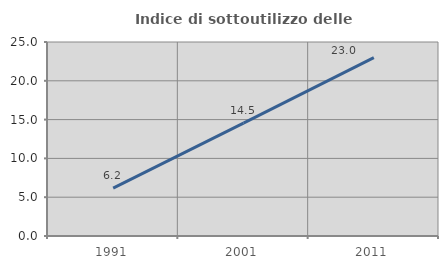
| Category | Indice di sottoutilizzo delle abitazioni  |
|---|---|
| 1991.0 | 6.17 |
| 2001.0 | 14.545 |
| 2011.0 | 22.993 |